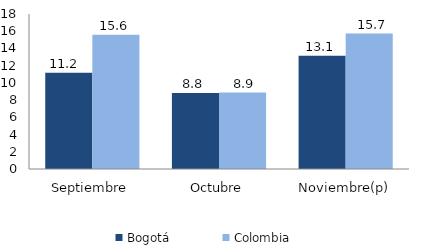
| Category | Bogotá | Colombia |
|---|---|---|
| Septiembre | 11.175 | 15.584 |
| Octubre | 8.835 | 8.873 |
| Noviembre(p) | 13.149 | 15.734 |